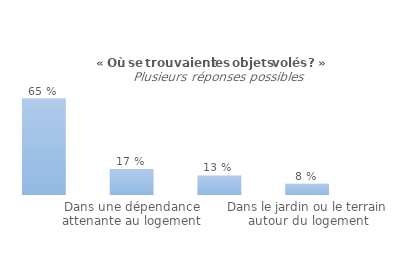
| Category | Series 0 |
|---|---|
| Dans le jardin ou le terrain autour du logement | 0.076 |
| Dans une dépendance non attenante au logement | 0.132 |
| Dans une dépendance attenante au logement | 0.174 |
| Dans le logement lui-même | 0.648 |